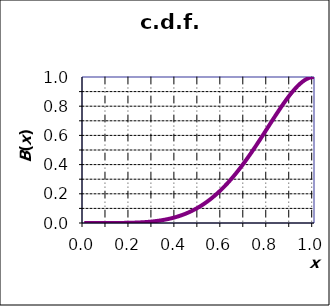
| Category | B(x) |
|---|---|
| 0.0 | 0 |
| 0.01 | 0 |
| 0.02 | 0 |
| 0.03 | 0 |
| 0.04 | 0 |
| 0.05 | 0 |
| 0.060000000000000005 | 0 |
| 0.07 | 0 |
| 0.08 | 0 |
| 0.09 | 0 |
| 0.09999999999999999 | 0 |
| 0.10999999999999999 | 0 |
| 0.11999999999999998 | 0 |
| 0.12999999999999998 | 0 |
| 0.13999999999999999 | 0 |
| 0.15 | 0 |
| 0.16 | 0.001 |
| 0.17 | 0.001 |
| 0.18000000000000002 | 0.001 |
| 0.19000000000000003 | 0.001 |
| 0.20000000000000004 | 0.002 |
| 0.21000000000000005 | 0.002 |
| 0.22000000000000006 | 0.003 |
| 0.23000000000000007 | 0.003 |
| 0.24000000000000007 | 0.004 |
| 0.25000000000000006 | 0.005 |
| 0.26000000000000006 | 0.006 |
| 0.2700000000000001 | 0.007 |
| 0.2800000000000001 | 0.008 |
| 0.2900000000000001 | 0.009 |
| 0.3000000000000001 | 0.011 |
| 0.3100000000000001 | 0.013 |
| 0.3200000000000001 | 0.015 |
| 0.3300000000000001 | 0.017 |
| 0.34000000000000014 | 0.02 |
| 0.35000000000000014 | 0.022 |
| 0.36000000000000015 | 0.025 |
| 0.37000000000000016 | 0.029 |
| 0.38000000000000017 | 0.032 |
| 0.3900000000000002 | 0.037 |
| 0.4000000000000002 | 0.041 |
| 0.4100000000000002 | 0.046 |
| 0.4200000000000002 | 0.051 |
| 0.4300000000000002 | 0.057 |
| 0.4400000000000002 | 0.063 |
| 0.45000000000000023 | 0.069 |
| 0.46000000000000024 | 0.076 |
| 0.47000000000000025 | 0.084 |
| 0.48000000000000026 | 0.092 |
| 0.49000000000000027 | 0.1 |
| 0.5000000000000002 | 0.109 |
| 0.5100000000000002 | 0.119 |
| 0.5200000000000002 | 0.129 |
| 0.5300000000000002 | 0.14 |
| 0.5400000000000003 | 0.152 |
| 0.5500000000000003 | 0.164 |
| 0.5600000000000003 | 0.176 |
| 0.5700000000000003 | 0.19 |
| 0.5800000000000003 | 0.203 |
| 0.5900000000000003 | 0.218 |
| 0.6000000000000003 | 0.233 |
| 0.6100000000000003 | 0.249 |
| 0.6200000000000003 | 0.266 |
| 0.6300000000000003 | 0.283 |
| 0.6400000000000003 | 0.301 |
| 0.6500000000000004 | 0.319 |
| 0.6600000000000004 | 0.338 |
| 0.6700000000000004 | 0.358 |
| 0.6800000000000004 | 0.378 |
| 0.6900000000000004 | 0.399 |
| 0.7000000000000004 | 0.42 |
| 0.7100000000000004 | 0.442 |
| 0.7200000000000004 | 0.464 |
| 0.7300000000000004 | 0.487 |
| 0.7400000000000004 | 0.51 |
| 0.7500000000000004 | 0.534 |
| 0.7600000000000005 | 0.558 |
| 0.7700000000000005 | 0.582 |
| 0.7800000000000005 | 0.606 |
| 0.7900000000000005 | 0.631 |
| 0.8000000000000005 | 0.655 |
| 0.8100000000000005 | 0.68 |
| 0.8200000000000005 | 0.704 |
| 0.8300000000000005 | 0.729 |
| 0.8400000000000005 | 0.753 |
| 0.8500000000000005 | 0.776 |
| 0.8600000000000005 | 0.8 |
| 0.8700000000000006 | 0.822 |
| 0.8800000000000006 | 0.844 |
| 0.8900000000000006 | 0.866 |
| 0.9000000000000006 | 0.886 |
| 0.9100000000000006 | 0.905 |
| 0.9200000000000006 | 0.923 |
| 0.9300000000000006 | 0.939 |
| 0.9400000000000006 | 0.954 |
| 0.9500000000000006 | 0.967 |
| 0.9600000000000006 | 0.978 |
| 0.9700000000000006 | 0.988 |
| 0.9800000000000006 | 0.994 |
| 0.9900000000000007 | 0.999 |
| 1.0000000000000007 | 1 |